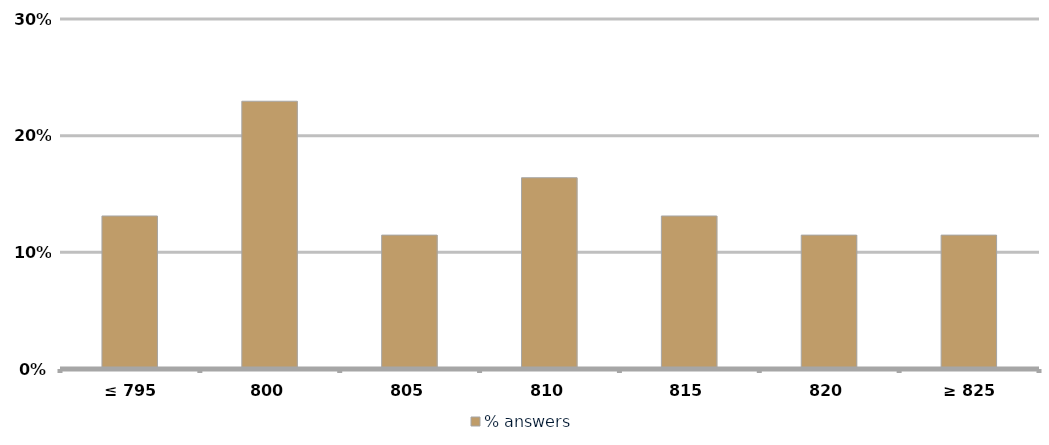
| Category | % answers |
|---|---|
| ≤ 795 | 0.131 |
| 800 | 0.23 |
| 805 | 0.115 |
| 810 | 0.164 |
| 815 | 0.131 |
| 820 | 0.115 |
| ≥ 825 | 0.115 |